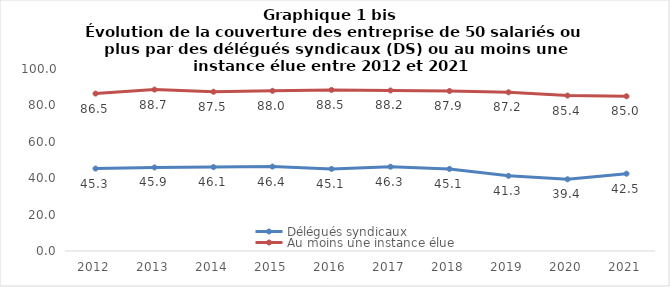
| Category | Délégués syndicaux | Au moins une instance élue  |
|---|---|---|
| 2012.0 | 45.3 | 86.5 |
| 2013.0 | 45.9 | 88.7 |
| 2014.0 | 46.1 | 87.5 |
| 2015.0 | 46.4 | 88 |
| 2016.0 | 45.1 | 88.5 |
| 2017.0 | 46.3 | 88.2 |
| 2018.0 | 45.1 | 87.9 |
| 2019.0 | 41.3 | 87.2 |
| 2020.0 | 39.4 | 85.4 |
| 2021.0 | 42.49 | 85 |